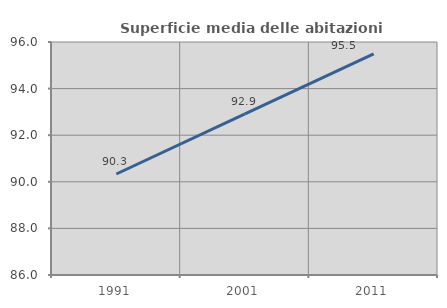
| Category | Superficie media delle abitazioni occupate |
|---|---|
| 1991.0 | 90.334 |
| 2001.0 | 92.912 |
| 2011.0 | 95.49 |